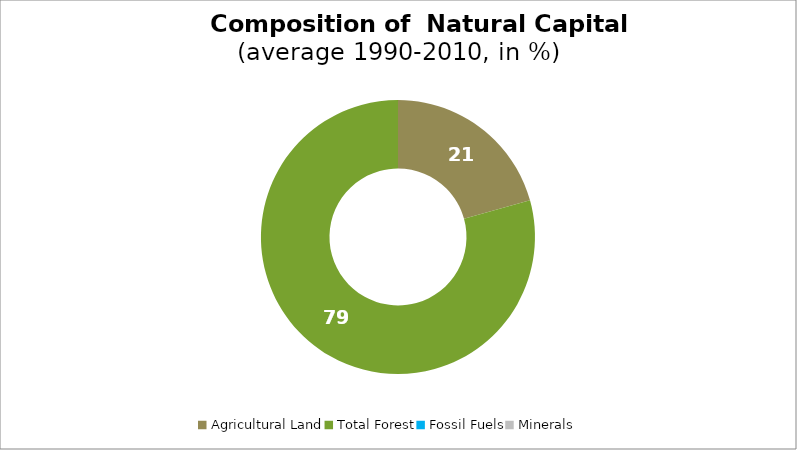
| Category | Series 0 |
|---|---|
| Agricultural Land | 20.692 |
| Total Forest | 79.308 |
| Fossil Fuels | 0 |
| Minerals | 0 |